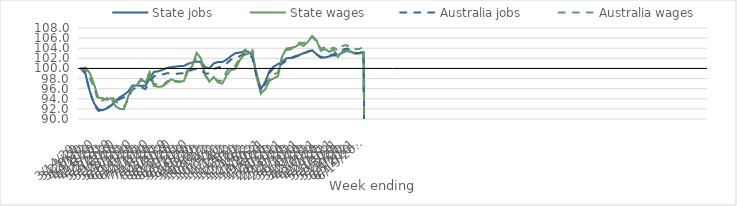
| Category | State jobs | State wages | Australia jobs | Australia wages |
|---|---|---|---|---|
| 14/03/2020 | 100 | 100 | 100 | 100 |
| 21/03/2020 | 98.973 | 100.167 | 98.971 | 99.604 |
| 28/03/2020 | 95.551 | 99.119 | 95.467 | 98.106 |
| 04/04/2020 | 93.129 | 96.962 | 92.922 | 96.239 |
| 11/04/2020 | 91.928 | 94.227 | 91.648 | 93.488 |
| 18/04/2020 | 91.741 | 94.142 | 91.632 | 93.693 |
| 25/04/2020 | 92.093 | 93.754 | 92.163 | 94.114 |
| 02/05/2020 | 92.669 | 94.194 | 92.661 | 94.661 |
| 09/05/2020 | 93.485 | 92.552 | 93.345 | 93.586 |
| 16/05/2020 | 94.28 | 92.025 | 93.938 | 92.82 |
| 23/05/2020 | 94.784 | 91.916 | 94.296 | 92.472 |
| 30/05/2020 | 95.436 | 94.446 | 94.804 | 93.802 |
| 06/06/2020 | 96.605 | 96.317 | 95.79 | 95.983 |
| 13/06/2020 | 96.615 | 96.696 | 96.291 | 96.659 |
| 20/06/2020 | 96.586 | 97.959 | 96.307 | 97.626 |
| 27/06/2020 | 96.574 | 97.224 | 95.924 | 97.398 |
| 04/07/2020 | 97.974 | 98.825 | 97.286 | 99.305 |
| 11/07/2020 | 99.323 | 96.564 | 98.453 | 96.936 |
| 18/07/2020 | 99.422 | 96.374 | 98.574 | 96.771 |
| 25/07/2020 | 99.715 | 96.43 | 98.8 | 96.557 |
| 01/08/2020 | 100.084 | 97.068 | 99.036 | 97.398 |
| 08/08/2020 | 100.25 | 97.853 | 99.039 | 97.865 |
| 15/08/2020 | 100.348 | 97.546 | 98.915 | 97.373 |
| 22/08/2020 | 100.476 | 97.408 | 99.01 | 97.336 |
| 29/08/2020 | 100.476 | 97.502 | 99.05 | 97.544 |
| 05/09/2020 | 100.928 | 99.51 | 99.381 | 100.291 |
| 12/09/2020 | 101.169 | 100.514 | 99.754 | 101.228 |
| 19/09/2020 | 101.355 | 103.083 | 99.918 | 101.971 |
| 26/09/2020 | 101.307 | 101.981 | 99.725 | 101.154 |
| 03/10/2020 | 100.248 | 98.581 | 98.937 | 98.795 |
| 10/10/2020 | 100.033 | 97.4 | 99.064 | 97.403 |
| 17/10/2020 | 101.001 | 98.313 | 99.896 | 98.12 |
| 24/10/2020 | 101.288 | 97.222 | 100.185 | 97.546 |
| 31/10/2020 | 101.25 | 97.007 | 100.363 | 97.615 |
| 07/11/2020 | 101.756 | 98.63 | 100.966 | 99.446 |
| 14/11/2020 | 102.435 | 99.701 | 101.741 | 100.424 |
| 21/11/2020 | 102.996 | 99.847 | 102.085 | 100.522 |
| 28/11/2020 | 103.139 | 101.516 | 102.383 | 101.813 |
| 05/12/2020 | 103.33 | 102.636 | 102.872 | 103.509 |
| 12/12/2020 | 103.33 | 102.91 | 102.957 | 104.014 |
| 19/12/2020 | 102.597 | 103.275 | 102.168 | 103.915 |
| 26/12/2020 | 98.946 | 98.352 | 98.391 | 98.452 |
| 02/01/2021 | 95.901 | 95.189 | 95.58 | 95.006 |
| 09/01/2021 | 97.298 | 95.811 | 96.988 | 96.148 |
| 16/01/2021 | 99.464 | 97.56 | 99.101 | 98.251 |
| 23/01/2021 | 100.372 | 98.052 | 100.068 | 98.817 |
| 30/01/2021 | 100.866 | 98.482 | 100.556 | 99.148 |
| 06/02/2021 | 101.255 | 102.437 | 100.923 | 102.467 |
| 13/02/2021 | 102.007 | 103.958 | 101.643 | 103.619 |
| 20/02/2021 | 102.078 | 104.086 | 101.902 | 103.78 |
| 27/02/2021 | 102.433 | 104.261 | 102.3 | 104.333 |
| 06/03/2021 | 102.674 | 104.833 | 102.521 | 105.064 |
| 13/03/2021 | 103.031 | 104.465 | 102.877 | 105.052 |
| 20/03/2021 | 103.3 | 105.271 | 103.384 | 105.539 |
| 27/03/2021 | 103.583 | 106.442 | 103.612 | 106.245 |
| 03/04/2021 | 102.837 | 105.591 | 102.769 | 105.395 |
| 10/04/2021 | 102.12 | 103.484 | 102.293 | 103.884 |
| 17/04/2021 | 102.183 | 103.846 | 102.308 | 104.211 |
| 24/04/2021 | 102.378 | 103.29 | 102.558 | 103.772 |
| 01/05/2021 | 102.592 | 103.704 | 102.806 | 104.122 |
| 08/05/2021 | 102.554 | 102.272 | 102.974 | 103.594 |
| 15/05/2021 | 103.11 | 103.267 | 103.642 | 104.439 |
| 22/05/2021 | 103.448 | 103.565 | 103.934 | 104.625 |
| 29/05/2021 | 103.349 | 103.257 | 103.744 | 104.038 |
| 05/06/2021 | 103.032 | 102.9 | 103.091 | 103.805 |
| 12/06/2021 | 102.986 | 103.001 | 103.033 | 103.851 |
| 19/06/2021 | 103.132 | 103.27 | 103.366 | 104.254 |